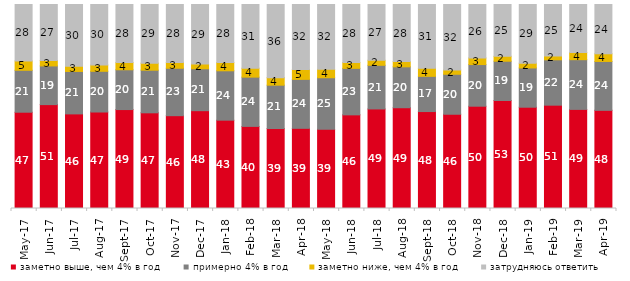
| Category | заметно выше, чем 4% в год | примерно 4% в год | заметно ниже, чем 4% в год | затрудняюсь ответить |
|---|---|---|---|---|
| 2017-05-01 | 47.2 | 20.55 | 4.55 | 27.7 |
| 2017-06-01 | 50.9 | 18.95 | 2.65 | 27.45 |
| 2017-07-01 | 46.35 | 20.8 | 2.5 | 30.3 |
| 2017-08-01 | 47.3 | 19.95 | 3.1 | 29.65 |
| 2017-09-01 | 48.5 | 19.5 | 3.55 | 28.45 |
| 2017-10-01 | 46.9 | 20.9 | 3.45 | 28.75 |
| 2017-11-01 | 45.5 | 23.25 | 2.85 | 28.4 |
| 2017-12-01 | 47.95 | 20.55 | 2.3 | 29.2 |
| 2018-01-01 | 43.3 | 24.2 | 4.05 | 28.45 |
| 2018-02-01 | 40.25 | 24.15 | 4.35 | 31.25 |
| 2018-03-01 | 39.2 | 21.25 | 3.7 | 35.85 |
| 2018-04-01 | 39.3 | 24 | 4.85 | 31.85 |
| 2018-05-01 | 38.8 | 25.3 | 4.15 | 31.75 |
| 2018-06-01 | 45.9 | 22.8 | 2.85 | 28.45 |
| 2018-07-01 | 48.8 | 21.4 | 2.45 | 27.35 |
| 2018-08-01 | 49.4 | 20.05 | 2.55 | 28 |
| 2018-09-01 | 47.5 | 17.25 | 4 | 31.2 |
| 2018-10-01 | 46.2 | 19.6 | 2.15 | 32.05 |
| 2018-11-01 | 50.15 | 20.409 | 3.244 | 26.198 |
| 2018-12-01 | 52.95 | 19.25 | 2.4 | 25.4 |
| 2019-01-01 | 49.65 | 19.25 | 2.3 | 28.8 |
| 2019-02-01 | 50.65 | 22.25 | 1.9 | 25.2 |
| 2019-03-01 | 48.583 | 24.366 | 3.531 | 23.521 |
| 2019-04-01 | 48.119 | 23.96 | 3.762 | 24.158 |